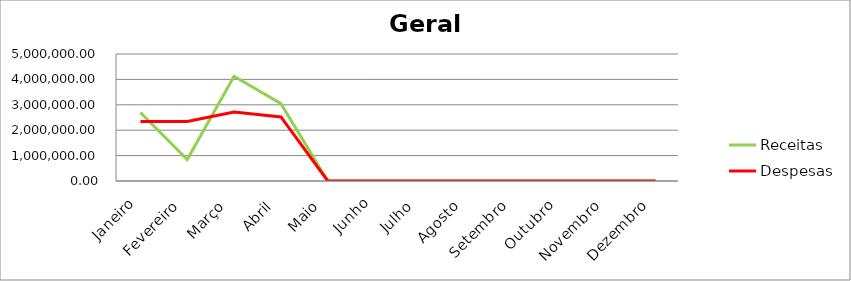
| Category | Receitas | Despesas |
|---|---|---|
| Janeiro | 2698058.06 | 2339055.74 |
| Fevereiro | 848107.96 | 2342237.57 |
| Março | 4122742.05 | 2712690.72 |
| Abril | 3043418.58 | 2523283.93 |
| Maio | 0 | 0 |
| Junho | 0 | 0 |
| Julho | 0 | 0 |
| Agosto | 0 | 0 |
| Setembro | 0 | 0 |
| Outubro | 0 | 0 |
| Novembro | 0 | 0 |
| Dezembro | 0 | 0 |